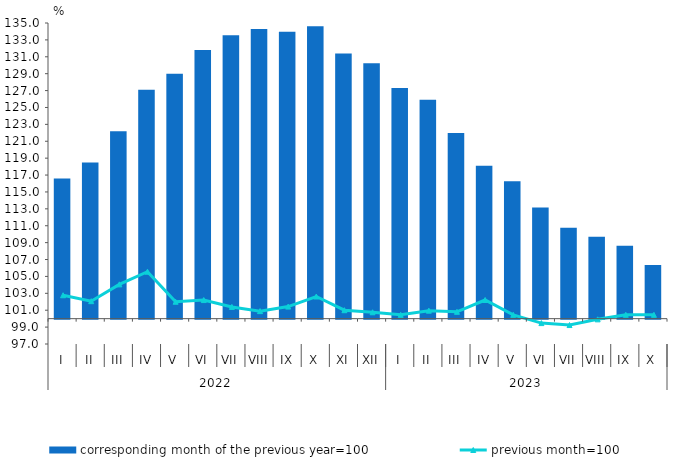
| Category | corresponding month of the previous year=100 |
|---|---|
| 0 | 116.6 |
| 1 | 118.5 |
| 2 | 122.2 |
| 3 | 127.1 |
| 4 | 129 |
| 5 | 131.8 |
| 6 | 133.55 |
| 7 | 134.29 |
| 8 | 133.97 |
| 9 | 134.62 |
| 10 | 131.4 |
| 11 | 130.24 |
| 12 | 127.307 |
| 13 | 125.905 |
| 14 | 121.977 |
| 15 | 118.102 |
| 16 | 116.262 |
| 17 | 113.152 |
| 18 | 110.755 |
| 19 | 109.689 |
| 20 | 108.634 |
| 21 | 106.342 |